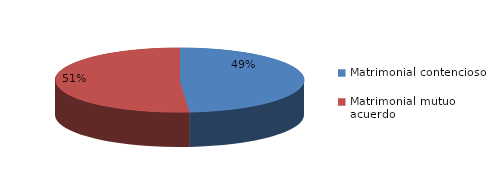
| Category | Series 0 |
|---|---|
| 0 | 2054 |
| 1 | 2161 |